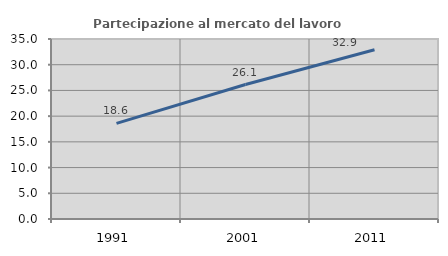
| Category | Partecipazione al mercato del lavoro  femminile |
|---|---|
| 1991.0 | 18.596 |
| 2001.0 | 26.141 |
| 2011.0 | 32.906 |